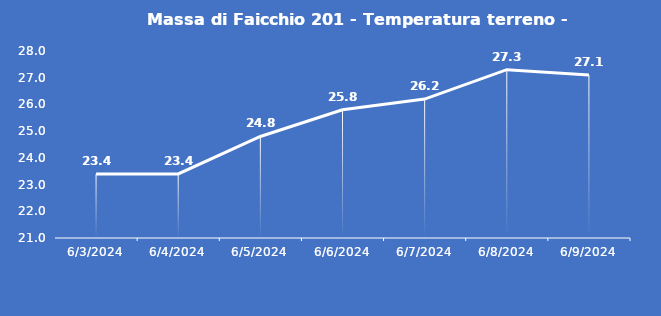
| Category | Massa di Faicchio 201 - Temperatura terreno - Grezzo (°C) |
|---|---|
| 6/3/24 | 23.4 |
| 6/4/24 | 23.4 |
| 6/5/24 | 24.8 |
| 6/6/24 | 25.8 |
| 6/7/24 | 26.2 |
| 6/8/24 | 27.3 |
| 6/9/24 | 27.1 |